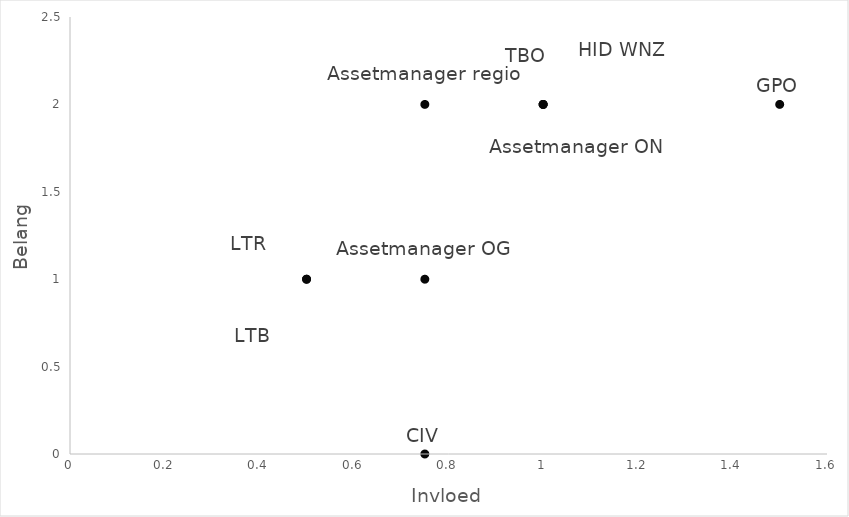
| Category | Series 0 |
|---|---|
| 0.75 | 0 |
| 0.5 | 1 |
| 1.0 | 2 |
| 1.0 | 2 |
| 0.5 | 1 |
| 0.75 | 2 |
| 0.75 | 1 |
| 1.0 | 2 |
| 1.5 | 2 |